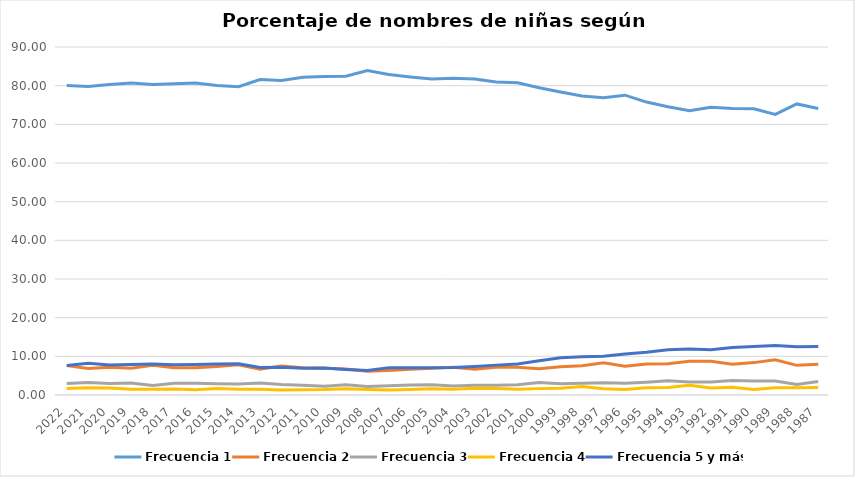
| Category | Frecuencia 1 | Frecuencia 2 | Frecuencia 3 | Frecuencia 4 | Frecuencia 5 y más |
|---|---|---|---|---|---|
| 2022.0 | 80.037 | 7.598 | 3.002 | 1.713 | 7.649 |
| 2021.0 | 79.813 | 6.852 | 3.251 | 1.869 | 8.215 |
| 2020.0 | 80.314 | 7.154 | 2.971 | 1.81 | 7.751 |
| 2019.0 | 80.68 | 6.92 | 3.083 | 1.458 | 7.859 |
| 2018.0 | 80.274 | 7.718 | 2.466 | 1.503 | 8.039 |
| 2017.0 | 80.521 | 7.051 | 3.068 | 1.569 | 7.792 |
| 2016.0 | 80.691 | 7.023 | 3.022 | 1.378 | 7.886 |
| 2015.0 | 80.028 | 7.387 | 2.885 | 1.669 | 8.031 |
| 2014.0 | 79.728 | 7.847 | 2.86 | 1.498 | 8.068 |
| 2013.0 | 81.581 | 6.676 | 3.125 | 1.499 | 7.118 |
| 2012.0 | 81.347 | 7.482 | 2.688 | 1.284 | 7.198 |
| 2011.0 | 82.155 | 7.042 | 2.522 | 1.385 | 6.896 |
| 2010.0 | 82.375 | 6.946 | 2.279 | 1.428 | 6.973 |
| 2009.0 | 82.463 | 6.695 | 2.625 | 1.601 | 6.616 |
| 2008.0 | 83.898 | 6.118 | 2.216 | 1.403 | 6.365 |
| 2007.0 | 82.897 | 6.365 | 2.421 | 1.273 | 7.043 |
| 2006.0 | 82.257 | 6.673 | 2.596 | 1.42 | 7.055 |
| 2005.0 | 81.729 | 6.946 | 2.647 | 1.602 | 7.076 |
| 2004.0 | 81.901 | 7.183 | 2.306 | 1.51 | 7.1 |
| 2003.0 | 81.728 | 6.638 | 2.543 | 1.732 | 7.359 |
| 2002.0 | 80.928 | 7.196 | 2.497 | 1.652 | 7.727 |
| 2001.0 | 80.76 | 7.147 | 2.634 | 1.468 | 7.99 |
| 2000.0 | 79.469 | 6.801 | 3.246 | 1.649 | 8.836 |
| 1999.0 | 78.349 | 7.336 | 2.94 | 1.723 | 9.653 |
| 1998.0 | 77.344 | 7.563 | 3.019 | 2.193 | 9.882 |
| 1997.0 | 76.882 | 8.328 | 3.198 | 1.599 | 9.993 |
| 1996.0 | 77.536 | 7.441 | 3.019 | 1.404 | 10.6 |
| 1995.0 | 75.76 | 8.032 | 3.292 | 1.881 | 11.035 |
| 1994.0 | 74.565 | 8.079 | 3.672 | 1.971 | 11.712 |
| 1993.0 | 73.523 | 8.748 | 3.344 | 2.488 | 11.897 |
| 1992.0 | 74.429 | 8.714 | 3.349 | 1.788 | 11.72 |
| 1991.0 | 74.087 | 7.925 | 3.73 | 1.981 | 12.277 |
| 1990.0 | 74.03 | 8.375 | 3.611 | 1.421 | 12.562 |
| 1989.0 | 72.559 | 9.12 | 3.592 | 1.897 | 12.833 |
| 1988.0 | 75.272 | 7.666 | 2.706 | 1.879 | 12.477 |
| 1987.0 | 74.112 | 7.942 | 3.513 | 1.909 | 12.524 |